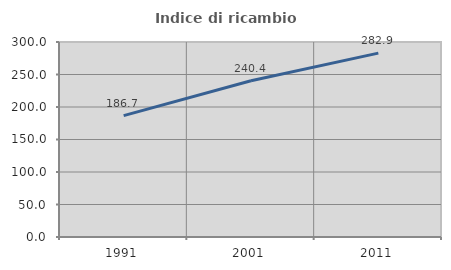
| Category | Indice di ricambio occupazionale  |
|---|---|
| 1991.0 | 186.747 |
| 2001.0 | 240.426 |
| 2011.0 | 282.895 |